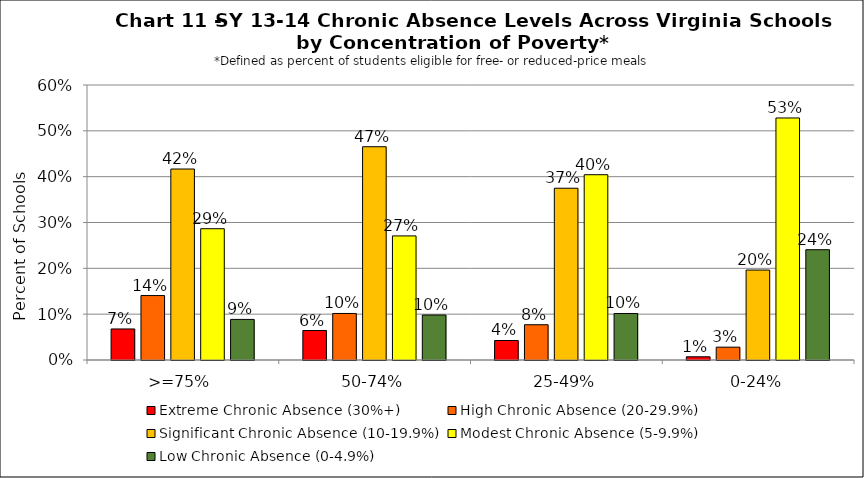
| Category | Extreme Chronic Absence (30%+) | High Chronic Absence (20-29.9%) | Significant Chronic Absence (10-19.9%) | Modest Chronic Absence (5-9.9%) | Low Chronic Absence (0-4.9%) |
|---|---|---|---|---|---|
| 0 | 0.068 | 0.141 | 0.417 | 0.286 | 0.089 |
| 1 | 0.064 | 0.102 | 0.465 | 0.271 | 0.098 |
| 2 | 0.043 | 0.077 | 0.375 | 0.404 | 0.101 |
| 3 | 0.007 | 0.028 | 0.196 | 0.528 | 0.241 |